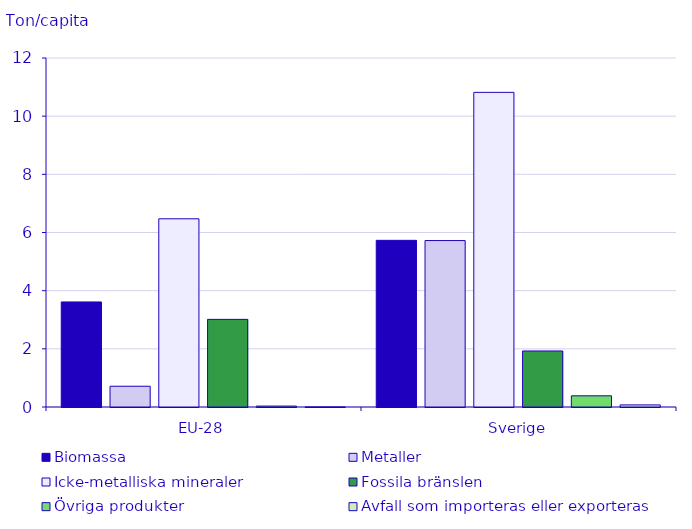
| Category | Biomassa | Metaller | Icke-metalliska mineraler | Fossila bränslen | Övriga produkter | Avfall som importeras eller exporteras |
|---|---|---|---|---|---|---|
| EU-28 | 3.612 | 0.714 | 6.471 | 3.013 | 0.032 | 0.002 |
| Sverige | 5.731 | 5.723 | 10.819 | 1.926 | 0.385 | 0.072 |